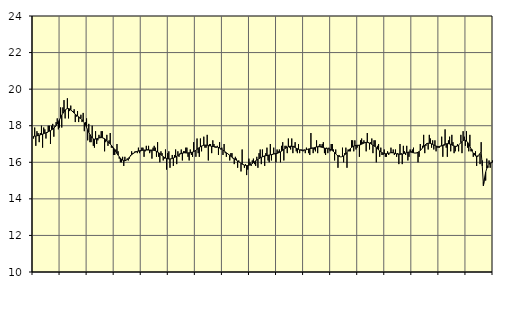
| Category | Handel, SNI 45-47 | Series 1 |
|---|---|---|
| nan | 17.3 | 17.42 |
| 87.0 | 17.9 | 17.43 |
| 87.0 | 16.9 | 17.43 |
| 87.0 | 17.7 | 17.45 |
| 87.0 | 17.6 | 17.46 |
| 87.0 | 17.1 | 17.48 |
| 87.0 | 17.6 | 17.5 |
| 87.0 | 18 | 17.52 |
| 87.0 | 16.8 | 17.54 |
| 87.0 | 17.9 | 17.56 |
| 87.0 | 17.8 | 17.59 |
| 87.0 | 17.3 | 17.61 |
| nan | 17.6 | 17.64 |
| 88.0 | 18 | 17.67 |
| 88.0 | 18 | 17.7 |
| 88.0 | 17 | 17.73 |
| 88.0 | 18 | 17.77 |
| 88.0 | 18.1 | 17.81 |
| 88.0 | 17.4 | 17.87 |
| 88.0 | 18 | 17.93 |
| 88.0 | 18.2 | 18.01 |
| 88.0 | 18.4 | 18.1 |
| 88.0 | 17.8 | 18.21 |
| 88.0 | 17.9 | 18.33 |
| nan | 19 | 18.45 |
| 89.0 | 17.9 | 18.57 |
| 89.0 | 19 | 18.68 |
| 89.0 | 19.4 | 18.77 |
| 89.0 | 18.4 | 18.86 |
| 89.0 | 18.9 | 18.91 |
| 89.0 | 19.5 | 18.94 |
| 89.0 | 18.4 | 18.94 |
| 89.0 | 18.8 | 18.92 |
| 89.0 | 19.1 | 18.87 |
| 89.0 | 18.8 | 18.81 |
| 89.0 | 18.8 | 18.75 |
| nan | 18.9 | 18.69 |
| 90.0 | 18.2 | 18.63 |
| 90.0 | 18.5 | 18.58 |
| 90.0 | 18.8 | 18.53 |
| 90.0 | 18.2 | 18.49 |
| 90.0 | 18.4 | 18.44 |
| 90.0 | 18.6 | 18.39 |
| 90.0 | 18.2 | 18.32 |
| 90.0 | 18.7 | 18.25 |
| 90.0 | 17.7 | 18.15 |
| 90.0 | 18.2 | 18.04 |
| 90.0 | 18.4 | 17.91 |
| nan | 17.2 | 17.78 |
| 91.0 | 18.1 | 17.64 |
| 91.0 | 17.1 | 17.52 |
| 91.0 | 17.1 | 17.41 |
| 91.0 | 18 | 17.33 |
| 91.0 | 16.9 | 17.28 |
| 91.0 | 16.8 | 17.26 |
| 91.0 | 17.7 | 17.27 |
| 91.0 | 17 | 17.29 |
| 91.0 | 17.2 | 17.31 |
| 91.0 | 17.5 | 17.33 |
| 91.0 | 17.4 | 17.34 |
| nan | 17.7 | 17.35 |
| 92.0 | 17.7 | 17.34 |
| 92.0 | 17.3 | 17.32 |
| 92.0 | 16.6 | 17.29 |
| 92.0 | 17.1 | 17.24 |
| 92.0 | 17.5 | 17.18 |
| 92.0 | 16.9 | 17.12 |
| 92.0 | 17.2 | 17.06 |
| 92.0 | 17.6 | 17 |
| 92.0 | 16.8 | 16.93 |
| 92.0 | 16.8 | 16.86 |
| 92.0 | 16.4 | 16.78 |
| nan | 16.4 | 16.68 |
| 93.0 | 16.7 | 16.58 |
| 93.0 | 17 | 16.48 |
| 93.0 | 16.6 | 16.39 |
| 93.0 | 16.2 | 16.3 |
| 93.0 | 16 | 16.23 |
| 93.0 | 16 | 16.16 |
| 93.0 | 16.3 | 16.12 |
| 93.0 | 15.8 | 16.09 |
| 93.0 | 16.3 | 16.08 |
| 93.0 | 16.1 | 16.11 |
| 93.0 | 16.2 | 16.15 |
| nan | 16.1 | 16.21 |
| 94.0 | 16.2 | 16.28 |
| 94.0 | 16.4 | 16.35 |
| 94.0 | 16.6 | 16.41 |
| 94.0 | 16.5 | 16.46 |
| 94.0 | 16.5 | 16.51 |
| 94.0 | 16.6 | 16.55 |
| 94.0 | 16.6 | 16.58 |
| 94.0 | 16.5 | 16.6 |
| 94.0 | 16.8 | 16.61 |
| 94.0 | 16.5 | 16.63 |
| 94.0 | 16.6 | 16.64 |
| nan | 16.8 | 16.65 |
| 95.0 | 16.8 | 16.66 |
| 95.0 | 16.3 | 16.67 |
| 95.0 | 16.6 | 16.67 |
| 95.0 | 16.9 | 16.67 |
| 95.0 | 16.7 | 16.67 |
| 95.0 | 16.9 | 16.67 |
| 95.0 | 16.5 | 16.67 |
| 95.0 | 16.6 | 16.67 |
| 95.0 | 16.2 | 16.67 |
| 95.0 | 16.8 | 16.66 |
| 95.0 | 16.9 | 16.65 |
| nan | 16.8 | 16.63 |
| 96.0 | 16.3 | 16.6 |
| 96.0 | 17.1 | 16.56 |
| 96.0 | 16.3 | 16.52 |
| 96.0 | 16 | 16.47 |
| 96.0 | 16.6 | 16.42 |
| 96.0 | 16.5 | 16.36 |
| 96.0 | 16.1 | 16.31 |
| 96.0 | 16.2 | 16.27 |
| 96.0 | 16.7 | 16.23 |
| 96.0 | 15.6 | 16.21 |
| 96.0 | 16.5 | 16.19 |
| nan | 16.6 | 16.18 |
| 97.0 | 15.7 | 16.18 |
| 97.0 | 16.2 | 16.19 |
| 97.0 | 16.4 | 16.21 |
| 97.0 | 15.8 | 16.23 |
| 97.0 | 16.4 | 16.26 |
| 97.0 | 16.7 | 16.29 |
| 97.0 | 15.9 | 16.33 |
| 97.0 | 16.6 | 16.37 |
| 97.0 | 16.3 | 16.41 |
| 97.0 | 16.5 | 16.45 |
| 97.0 | 16.7 | 16.48 |
| nan | 16.1 | 16.5 |
| 98.0 | 16.6 | 16.51 |
| 98.0 | 16.6 | 16.52 |
| 98.0 | 16.8 | 16.51 |
| 98.0 | 16.8 | 16.51 |
| 98.0 | 16.3 | 16.51 |
| 98.0 | 16.1 | 16.52 |
| 98.0 | 16.7 | 16.52 |
| 98.0 | 16.4 | 16.54 |
| 98.0 | 16.3 | 16.56 |
| 98.0 | 17.1 | 16.58 |
| 98.0 | 16.6 | 16.62 |
| nan | 16.3 | 16.66 |
| 99.0 | 17.3 | 16.71 |
| 99.0 | 16.5 | 16.76 |
| 99.0 | 16.3 | 16.81 |
| 99.0 | 17.3 | 16.85 |
| 99.0 | 16.6 | 16.89 |
| 99.0 | 16.9 | 16.91 |
| 99.0 | 17.4 | 16.93 |
| 99.0 | 16.8 | 16.94 |
| 99.0 | 16.8 | 16.94 |
| 99.0 | 17.5 | 16.93 |
| 99.0 | 16.1 | 16.92 |
| nan | 17 | 16.9 |
| 0.0 | 17 | 16.89 |
| 0.0 | 16.5 | 16.87 |
| 0.0 | 17.2 | 16.86 |
| 0.0 | 17 | 16.86 |
| 0.0 | 16.8 | 16.85 |
| 0.0 | 16.8 | 16.84 |
| 0.0 | 16.9 | 16.83 |
| 0.0 | 16.4 | 16.81 |
| 0.0 | 17.1 | 16.78 |
| 0.0 | 16.7 | 16.75 |
| 0.0 | 16.8 | 16.71 |
| nan | 16.4 | 16.66 |
| 1.0 | 17 | 16.62 |
| 1.0 | 16.5 | 16.57 |
| 1.0 | 16.3 | 16.52 |
| 1.0 | 16.5 | 16.48 |
| 1.0 | 16.4 | 16.43 |
| 1.0 | 16.1 | 16.38 |
| 1.0 | 16.5 | 16.33 |
| 1.0 | 16.5 | 16.28 |
| 1.0 | 16.2 | 16.23 |
| 1.0 | 15.9 | 16.19 |
| 1.0 | 16.3 | 16.15 |
| nan | 16.2 | 16.11 |
| 2.0 | 15.7 | 16.07 |
| 2.0 | 16.1 | 16.03 |
| 2.0 | 16 | 15.99 |
| 2.0 | 15.5 | 15.94 |
| 2.0 | 16.7 | 15.9 |
| 2.0 | 15.9 | 15.87 |
| 2.0 | 15.7 | 15.84 |
| 2.0 | 15.9 | 15.83 |
| 2.0 | 15.3 | 15.82 |
| 2.0 | 15.6 | 15.82 |
| 2.0 | 16.2 | 15.84 |
| nan | 16 | 15.86 |
| 3.0 | 15.8 | 15.89 |
| 3.0 | 16.1 | 15.93 |
| 3.0 | 16.2 | 15.98 |
| 3.0 | 15.9 | 16.03 |
| 3.0 | 15.8 | 16.08 |
| 3.0 | 16.3 | 16.12 |
| 3.0 | 15.7 | 16.16 |
| 3.0 | 16.5 | 16.2 |
| 3.0 | 16.7 | 16.24 |
| 3.0 | 15.9 | 16.27 |
| 3.0 | 16.7 | 16.3 |
| nan | 16.3 | 16.33 |
| 4.0 | 15.8 | 16.35 |
| 4.0 | 16.5 | 16.36 |
| 4.0 | 16.8 | 16.37 |
| 4.0 | 16.1 | 16.38 |
| 4.0 | 16 | 16.4 |
| 4.0 | 17 | 16.41 |
| 4.0 | 16.1 | 16.42 |
| 4.0 | 16.4 | 16.44 |
| 4.0 | 16.8 | 16.45 |
| 4.0 | 16.5 | 16.46 |
| 4.0 | 16 | 16.47 |
| nan | 16.7 | 16.49 |
| 5.0 | 16.6 | 16.51 |
| 5.0 | 16.7 | 16.54 |
| 5.0 | 16 | 16.57 |
| 5.0 | 16.9 | 16.61 |
| 5.0 | 17.1 | 16.66 |
| 5.0 | 16.1 | 16.7 |
| 5.0 | 16.9 | 16.75 |
| 5.0 | 16.9 | 16.79 |
| 5.0 | 16.5 | 16.82 |
| 5.0 | 17.3 | 16.85 |
| 5.0 | 16.8 | 16.87 |
| nan | 16.7 | 16.88 |
| 6.0 | 17.3 | 16.87 |
| 6.0 | 16.5 | 16.86 |
| 6.0 | 16.9 | 16.84 |
| 6.0 | 17.1 | 16.81 |
| 6.0 | 16.6 | 16.77 |
| 6.0 | 16.5 | 16.74 |
| 6.0 | 17 | 16.71 |
| 6.0 | 16.5 | 16.68 |
| 6.0 | 16.7 | 16.66 |
| 6.0 | 16.7 | 16.65 |
| 6.0 | 16.6 | 16.65 |
| nan | 16.7 | 16.66 |
| 7.0 | 16.5 | 16.67 |
| 7.0 | 16.8 | 16.69 |
| 7.0 | 16.7 | 16.71 |
| 7.0 | 16.5 | 16.73 |
| 7.0 | 16.4 | 16.74 |
| 7.0 | 17.6 | 16.76 |
| 7.0 | 16.8 | 16.77 |
| 7.0 | 16.5 | 16.78 |
| 7.0 | 16.7 | 16.8 |
| 7.0 | 16.6 | 16.82 |
| 7.0 | 17.2 | 16.84 |
| nan | 16.5 | 16.85 |
| 8.0 | 16.9 | 16.85 |
| 8.0 | 17 | 16.85 |
| 8.0 | 16.9 | 16.83 |
| 8.0 | 17 | 16.82 |
| 8.0 | 17.1 | 16.8 |
| 8.0 | 16.5 | 16.78 |
| 8.0 | 16.4 | 16.76 |
| 8.0 | 16.8 | 16.75 |
| 8.0 | 16.5 | 16.74 |
| 8.0 | 16.8 | 16.73 |
| 8.0 | 16.6 | 16.71 |
| nan | 17 | 16.68 |
| 9.0 | 17 | 16.64 |
| 9.0 | 16.7 | 16.59 |
| 9.0 | 16.1 | 16.53 |
| 9.0 | 16.7 | 16.46 |
| 9.0 | 16.4 | 16.4 |
| 9.0 | 15.7 | 16.35 |
| 9.0 | 16.4 | 16.32 |
| 9.0 | 16.3 | 16.3 |
| 9.0 | 16.3 | 16.3 |
| 9.0 | 16.8 | 16.32 |
| 9.0 | 16 | 16.35 |
| nan | 16.5 | 16.4 |
| 10.0 | 16.8 | 16.46 |
| 10.0 | 15.7 | 16.53 |
| 10.0 | 16.7 | 16.61 |
| 10.0 | 16.6 | 16.68 |
| 10.0 | 16.6 | 16.75 |
| 10.0 | 17.2 | 16.81 |
| 10.0 | 17.2 | 16.85 |
| 10.0 | 16.6 | 16.89 |
| 10.0 | 17.2 | 16.91 |
| 10.0 | 16.7 | 16.92 |
| 10.0 | 16.8 | 16.93 |
| nan | 16.9 | 16.93 |
| 11.0 | 16.3 | 16.94 |
| 11.0 | 17.2 | 16.96 |
| 11.0 | 17.3 | 16.99 |
| 11.0 | 17.1 | 17.02 |
| 11.0 | 17.2 | 17.05 |
| 11.0 | 17.1 | 17.08 |
| 11.0 | 16.6 | 17.09 |
| 11.0 | 17.6 | 17.09 |
| 11.0 | 17.1 | 17.07 |
| 11.0 | 16.7 | 17.05 |
| 11.0 | 17.1 | 17.02 |
| nan | 17.3 | 16.98 |
| 12.0 | 16.5 | 16.94 |
| 12.0 | 17.2 | 16.9 |
| 12.0 | 17.2 | 16.85 |
| 12.0 | 16 | 16.8 |
| 12.0 | 16.9 | 16.74 |
| 12.0 | 17 | 16.68 |
| 12.0 | 16.3 | 16.62 |
| 12.0 | 16.8 | 16.57 |
| 12.0 | 16.4 | 16.53 |
| 12.0 | 16.4 | 16.5 |
| 12.0 | 16.7 | 16.48 |
| nan | 16.3 | 16.47 |
| 13.0 | 16.3 | 16.47 |
| 13.0 | 16.6 | 16.49 |
| 13.0 | 16.4 | 16.5 |
| 13.0 | 16.5 | 16.51 |
| 13.0 | 16.8 | 16.53 |
| 13.0 | 16.5 | 16.53 |
| 13.0 | 16.7 | 16.52 |
| 13.0 | 16.4 | 16.5 |
| 13.0 | 16.7 | 16.48 |
| 13.0 | 16.3 | 16.46 |
| 13.0 | 16.5 | 16.45 |
| nan | 15.9 | 16.44 |
| 14.0 | 17 | 16.44 |
| 14.0 | 16.5 | 16.44 |
| 14.0 | 15.9 | 16.45 |
| 14.0 | 16.9 | 16.47 |
| 14.0 | 16.6 | 16.49 |
| 14.0 | 16.4 | 16.51 |
| 14.0 | 16.9 | 16.53 |
| 14.0 | 16.1 | 16.55 |
| 14.0 | 16.3 | 16.56 |
| 14.0 | 16.7 | 16.56 |
| 14.0 | 16.6 | 16.55 |
| nan | 16.7 | 16.53 |
| 15.0 | 16.8 | 16.52 |
| 15.0 | 16.5 | 16.51 |
| 15.0 | 16.5 | 16.51 |
| 15.0 | 16.5 | 16.52 |
| 15.0 | 16 | 16.55 |
| 15.0 | 16.3 | 16.59 |
| 15.0 | 17 | 16.64 |
| 15.0 | 16.7 | 16.71 |
| 15.0 | 16.9 | 16.78 |
| 15.0 | 17.5 | 16.86 |
| 15.0 | 16.5 | 16.93 |
| nan | 16.9 | 16.99 |
| 16.0 | 17 | 17.03 |
| 16.0 | 16.7 | 17.04 |
| 16.0 | 17.5 | 17.04 |
| 16.0 | 17.3 | 17.03 |
| 16.0 | 16.8 | 17.01 |
| 16.0 | 17.2 | 16.98 |
| 16.0 | 16.7 | 16.95 |
| 16.0 | 17.2 | 16.92 |
| 16.0 | 16.6 | 16.89 |
| 16.0 | 16.8 | 16.87 |
| 16.0 | 16.8 | 16.86 |
| nan | 16.8 | 16.87 |
| 17.0 | 16.9 | 16.88 |
| 17.0 | 17.4 | 16.9 |
| 17.0 | 16.3 | 16.93 |
| 17.0 | 16.9 | 16.96 |
| 17.0 | 17.8 | 16.99 |
| 17.0 | 16.8 | 17.01 |
| 17.0 | 16.3 | 17.02 |
| 17.0 | 17.2 | 17.02 |
| 17.0 | 17.4 | 17 |
| 17.0 | 16.6 | 16.98 |
| 17.0 | 17.5 | 16.95 |
| nan | 17.1 | 16.92 |
| 18.0 | 16.5 | 16.89 |
| 18.0 | 16.6 | 16.87 |
| 18.0 | 16.9 | 16.87 |
| 18.0 | 17 | 16.9 |
| 18.0 | 16.6 | 16.94 |
| 18.0 | 17 | 17 |
| 18.0 | 17.5 | 17.07 |
| 18.0 | 16.5 | 17.13 |
| 18.0 | 17.7 | 17.18 |
| 18.0 | 17.4 | 17.21 |
| 18.0 | 16.9 | 17.2 |
| nan | 17.7 | 17.16 |
| 19.0 | 16.8 | 17.09 |
| 19.0 | 16.6 | 16.99 |
| 19.0 | 17.5 | 16.88 |
| 19.0 | 16.6 | 16.74 |
| 19.0 | 16.7 | 16.61 |
| 19.0 | 16.3 | 16.5 |
| 19.0 | 16.5 | 16.41 |
| 19.0 | 16.6 | 16.35 |
| 19.0 | 15.8 | 16.34 |
| 19.0 | 16.3 | 16.35 |
| 19.0 | 16.4 | 16.4 |
| nan | 15.9 | 16.48 |
| 20.0 | 17.1 | 16.57 |
| 20.0 | 16.1 | 15.79 |
| 20.0 | 14.9 | 14.72 |
| 20.0 | 15.1 | 15.15 |
| 20.0 | 15 | 15.46 |
| 20.0 | 16.2 | 15.67 |
| 20.0 | 15.7 | 15.81 |
| 20.0 | 16.1 | 15.9 |
| 20.0 | 15.7 | 15.95 |
| 20.0 | 16 | 15.97 |
| 20.0 | 16.1 | 15.99 |